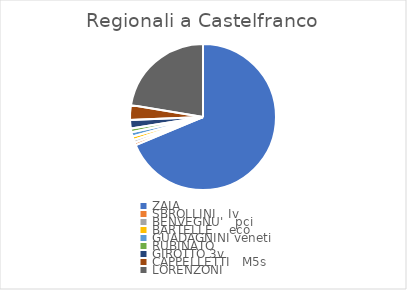
| Category | Series 0 |
|---|---|
| ZAIA | 12394 |
| SBROLLINI   Iv | 105 |
| BENVEGNU'   pci | 112 |
| BARTELLE    eco | 142 |
| GUADAGNINI veneti | 172 |
| RUBINATO | 148 |
| GIROTTO 3v | 339 |
| CAPPELLETTI   M5s | 592 |
| LORENZONI | 4038 |